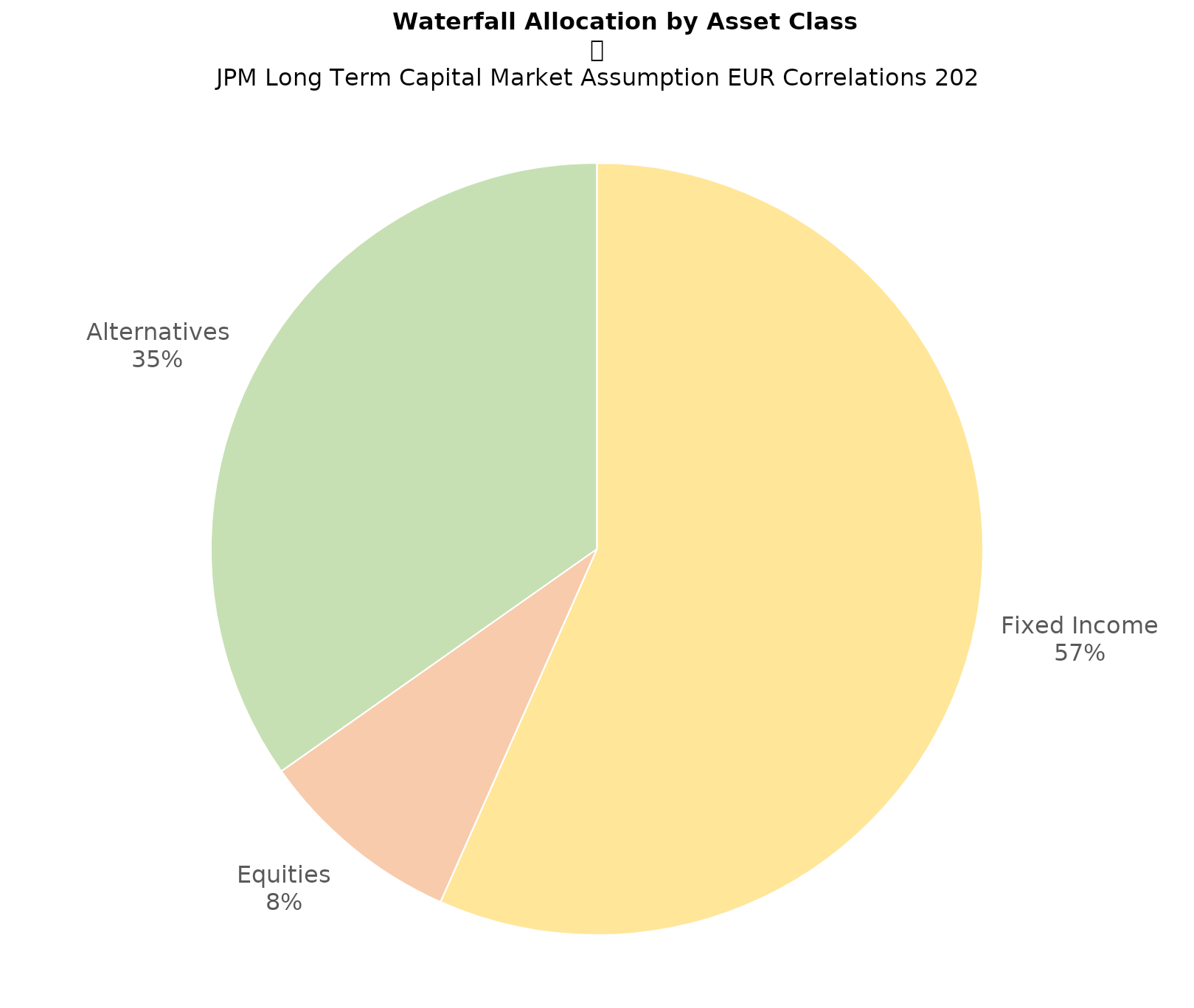
| Category | Series 0 |
|---|---|
|  Fixed Income  | 0.566 |
|  Equities  | 0.086 |
|  Alternatives  | 0.348 |